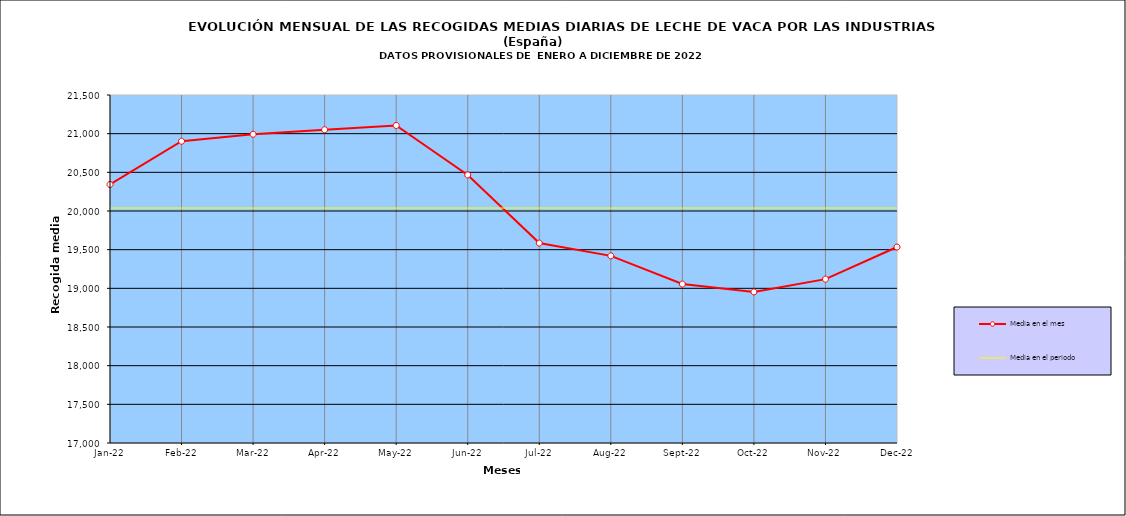
| Category | Media en el mes | Media en el periodo |
|---|---|---|
| 2022-01-01 | 20342.871 | 20038.29 |
| 2022-02-01 | 20902.286 | 20038.29 |
| 2022-03-01 | 20992.355 | 20038.29 |
| 2022-04-01 | 21050.7 | 20038.29 |
| 2022-05-01 | 21105.871 | 20038.29 |
| 2022-06-01 | 20466.667 | 20038.29 |
| 2022-07-01 | 19585.581 | 20038.29 |
| 2022-08-01 | 19419.71 | 20038.29 |
| 2022-09-01 | 19055.367 | 20038.29 |
| 2022-10-01 | 18954 | 20038.29 |
| 2022-11-01 | 19118.7 | 20038.29 |
| 2022-12-01 | 19534.097 | 20038.29 |